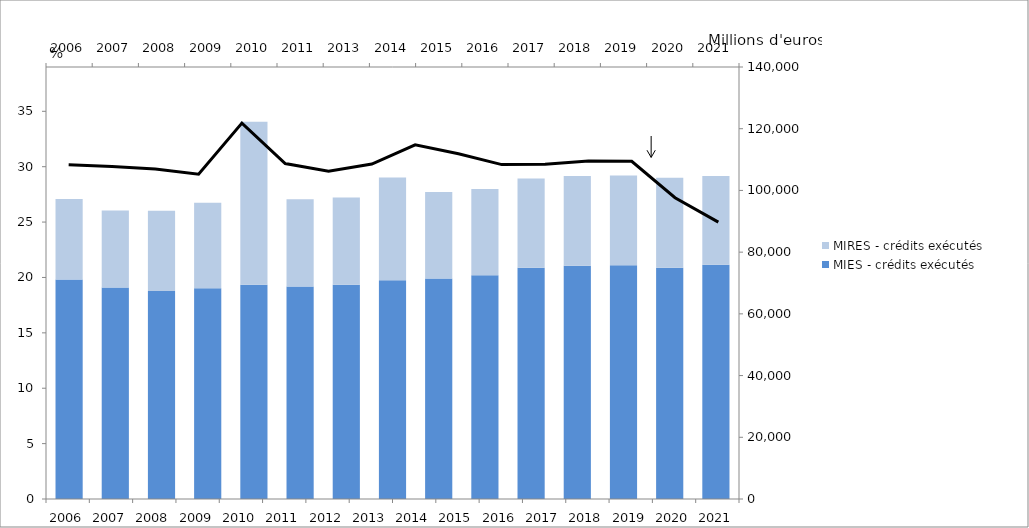
| Category | MIES - crédits exécutés  | MIRES - crédits exécutés |
|---|---|---|
| 2006.0 | 71155.684 | 26057.42 |
| 2007.0 | 68567.746 | 24889.481 |
| 2008.0 | 67433.181 | 25986.339 |
| 2009.0 | 68293.496 | 27685.608 |
| 2010.0 | 69427.373 | 52811.991 |
| 2011.0 | 68874.724 | 28283.92 |
| 2013.0 | 69465.033 | 28247.055 |
| 2014.0 | 70890.397 | 33266.091 |
| 2015.0 | 71474.656 | 27995.593 |
| 2016.0 | 72530.869 | 27925.633 |
| 2017.0 | 74924.683 | 28979.249 |
| 2018.0 | 75594.04 | 29092.211 |
| 2019.0 | 75738.053 | 29126.36 |
| 2020.0 | 74954.346 | 29130.651 |
| 2021.0 | 75897.802 | 28774.056 |